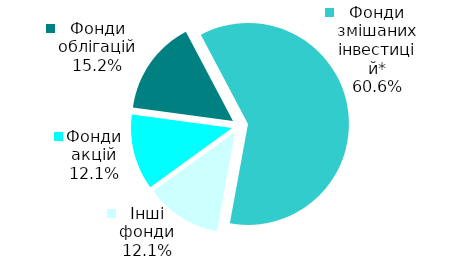
| Category | Series 0 |
|---|---|
| Фонди акцій | 4 |
| Фонди облігацій | 5 |
| Фонди змішаних інвестицій* | 20 |
| Інші фонди | 4 |